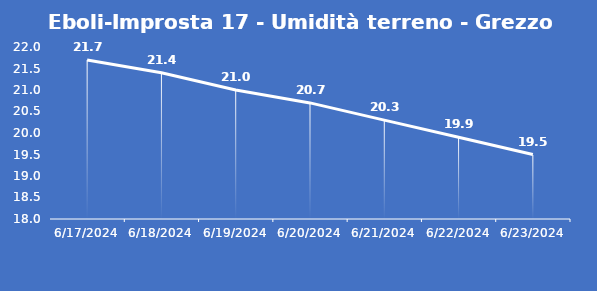
| Category | Eboli-Improsta 17 - Umidità terreno - Grezzo (%VWC) |
|---|---|
| 6/17/24 | 21.7 |
| 6/18/24 | 21.4 |
| 6/19/24 | 21 |
| 6/20/24 | 20.7 |
| 6/21/24 | 20.3 |
| 6/22/24 | 19.9 |
| 6/23/24 | 19.5 |